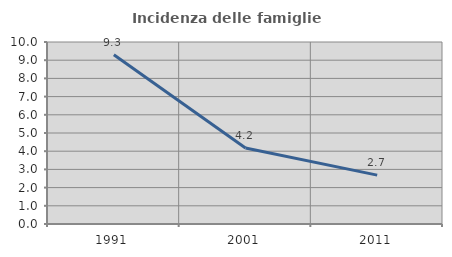
| Category | Incidenza delle famiglie numerose |
|---|---|
| 1991.0 | 9.297 |
| 2001.0 | 4.177 |
| 2011.0 | 2.685 |